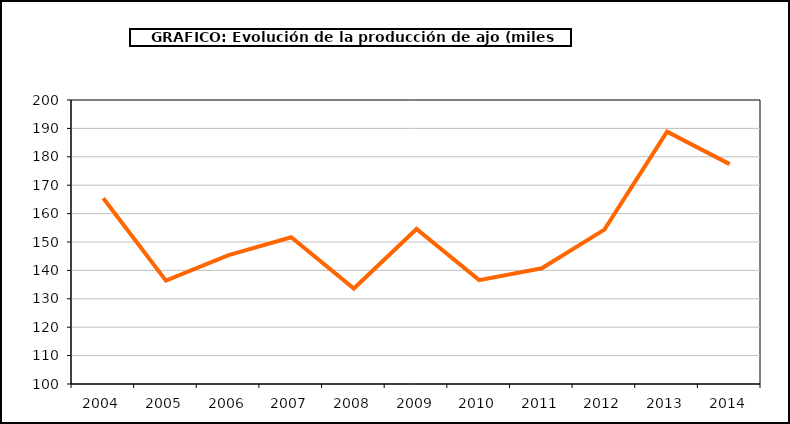
| Category | producción |
|---|---|
| 2004.0 | 165.425 |
| 2005.0 | 136.4 |
| 2006.0 | 145.372 |
| 2007.0 | 151.674 |
| 2008.0 | 133.61 |
| 2009.0 | 154.587 |
| 2010.0 | 136.561 |
| 2011.0 | 140.762 |
| 2012.0 | 154.363 |
| 2013.0 | 188.84 |
| 2014.0 | 177.427 |